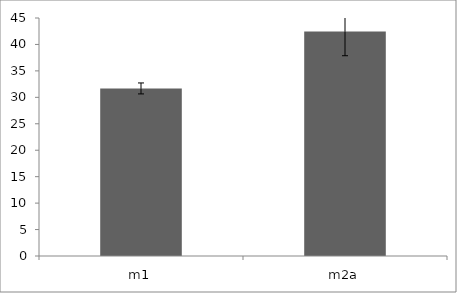
| Category | Series 0 |
|---|---|
| m1 | 31.684 |
| m2a | 42.45 |